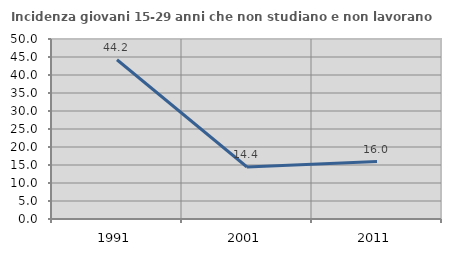
| Category | Incidenza giovani 15-29 anni che non studiano e non lavorano  |
|---|---|
| 1991.0 | 44.237 |
| 2001.0 | 14.438 |
| 2011.0 | 15.962 |